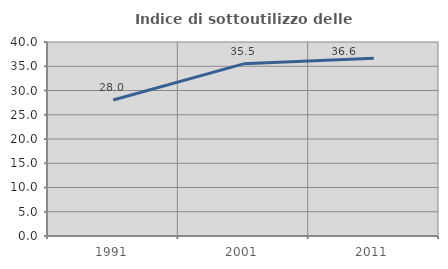
| Category | Indice di sottoutilizzo delle abitazioni  |
|---|---|
| 1991.0 | 28.029 |
| 2001.0 | 35.5 |
| 2011.0 | 36.627 |